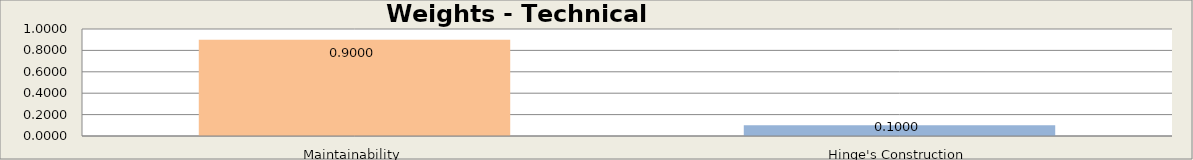
| Category | Technical Maintainability |
|---|---|
| Maintainability | 0.9 |
| Hinge's Construction | 0.1 |